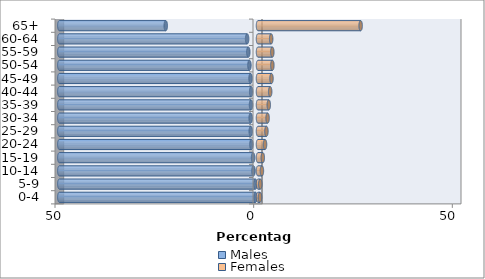
| Category | Males | Females |
|---|---|---|
| 0-4 | -0.631 | 0.507 |
| 5-9 | -0.668 | 0.569 |
| 10-14 | -1.137 | 0.983 |
| 15-19 | -1.236 | 1.205 |
| 20-24 | -1.657 | 1.768 |
| 25-29 | -1.824 | 2.12 |
| 30-34 | -1.842 | 2.417 |
| 35-39 | -1.756 | 2.714 |
| 40-44 | -1.718 | 3.066 |
| 45-49 | -1.873 | 3.394 |
| 50-54 | -2.157 | 3.616 |
| 55-59 | -2.436 | 3.604 |
| 60-64 | -2.738 | 3.313 |
| 65+ | -23.218 | 25.833 |